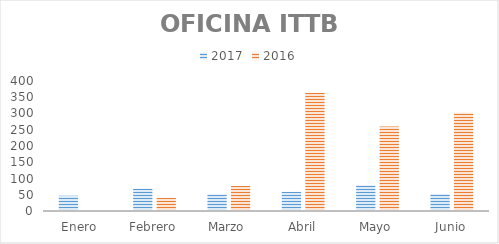
| Category | 2017 | 2016 |
|---|---|---|
| Enero | 47 | 0 |
| Febrero | 69 | 40 |
| Marzo | 51 | 77 |
| Abril | 59 | 364 |
| Mayo | 79 | 260 |
| Junio | 52 | 302 |